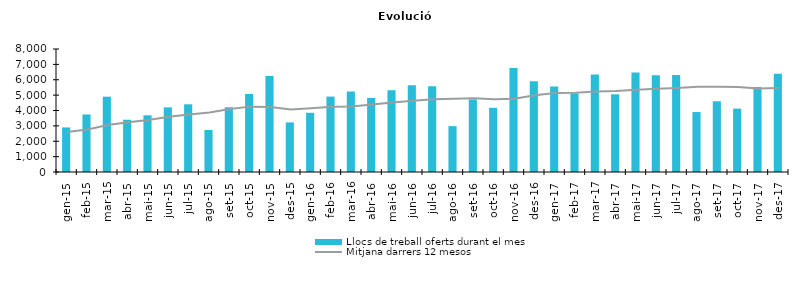
| Category | Llocs de treball oferts durant el mes |
|---|---|
| gen-15 | 2898 |
| feb-15 | 3740 |
| mar-15 | 4899 |
| abr-15 | 3400 |
| mai-15 | 3687 |
| jun-15 | 4205 |
| jul-15 | 4404 |
| ago-15 | 2731 |
| set-15 | 4212 |
| oct-15 | 5076 |
| nov-15 | 6242 |
| des-15 | 3226 |
| gen-16 | 3852 |
| feb-16 | 4906 |
| mar-16 | 5234 |
| abr-16 | 4818 |
| mai-16 | 5320 |
| jun-16 | 5650 |
| jul-16 | 5582 |
| ago-16 | 2982 |
| set-16 | 4715 |
| oct-16 | 4175 |
| nov-16 | 6759 |
| des-16 | 5907 |
| gen-17 | 5555 |
| feb-17 | 5107 |
| mar-17 | 6334 |
| abr-17 | 5053 |
| mai-17 | 6468 |
| jun-17 | 6286 |
| jul-17 | 6307 |
| ago-17 | 3900 |
| set-17 | 4601 |
| oct-17 | 4123 |
| nov-17 | 5532 |
| des-17 | 6392 |